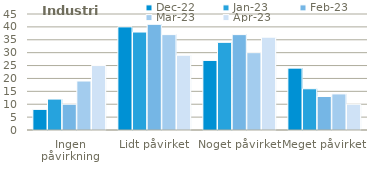
| Category | dec-22 | jan-23 | feb-23 | mar-23 | apr-23 |
|---|---|---|---|---|---|
| Ingen påvirkning | 8 | 12 | 10 | 19 | 25 |
| Lidt påvirket | 40 | 38 | 41 | 37 | 29 |
| Noget påvirket | 27 | 34 | 37 | 30 | 36 |
| Meget påvirket | 24 | 16 | 13 | 14 | 10 |